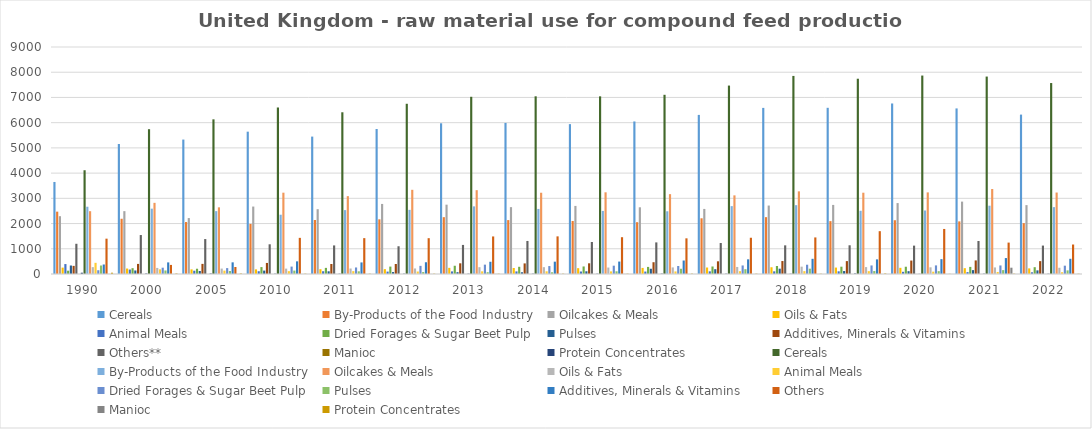
| Category | Cereals | By-Products of the Food Industry | Oilcakes & Meals | Oils & Fats | Animal Meals | Dried Forages & Sugar Beet Pulp
 | Pulses | Additives, Minerals & Vitamins | Others** | Manioc | Protein Concentrates | Others |
|---|---|---|---|---|---|---|---|---|---|---|---|---|
| 1990 | 4114 | 2667 | 2490 | 272 | 443 | 149 | 337 | 377 | 1198 | 3 | 51 | 1401 |
| 2000 | 5741 | 2590 | 2821 | 241 | 185 | 250 | 140 | 460 | 1545 | 0 | 21 | 360 |
| 2005 | 6132 | 2492 | 2643 | 215 | 134 | 234 | 119 | 462 | 1385 | 0 | 21 | 277 |
| 2010 | 6602 | 2350 | 3224 | 213 | 113 | 294 | 135 | 502 | 1178 | 2 | 13 | 1433 |
| 2011 | 6412 | 2533 | 3087 | 218 | 114 | 259 | 107 | 459 | 1133 | 1 | 13 | 1422 |
| 2012 | 6749 | 2543 | 3338 | 219 | 99 | 323 | 77 | 466 | 1100 | 3 | 13 | 1420 |
| 2013 | 7026 | 2681 | 3324 | 270 | 106 | 371 | 72 | 485 | 1153 | 4 | 13 | 1489 |
| 2014 | 7045 | 2580 | 3222 | 271 | 107 | 315 | 69 | 489 | 1310 | 2 | 13 | 1492 |
| 2015 | 7044 | 2501 | 3239 | 256 | 104 | 330 | 107 | 493 | 1269 | 4 | 13 | 1459 |
| 2016 | 7105 | 2487 | 3166 | 261 | 102 | 317 | 208 | 535 | 1253 | 0 | 15 | 1414 |
| 2017 | 7471 | 2691 | 3118 | 279 | 112 | 339 | 191 | 582 | 1228 | 0 | 13 | 1437 |
| 2018 | 7853 | 2729 | 3277 | 291 | 113 | 368 | 211 | 602 | 1136 | 0 | 11 | 1450 |
| 2019 | 7742 | 2506 | 3223 | 274 | 113 | 339 | 117 | 580 | 1139 | 0 | 22 | 1698 |
| 2020 | 7868 | 2518 | 3236 | 265 | 93 | 341 | 113 | 589 | 1125 | 0 | 7 | 1786 |
| 2021 | 7828 | 2708 | 3369.1 | 260 | 81 | 339 | 154 | 632 | 1309 | 250 | 13 | 1245 |
| 2022 | 7571 | 2651 | 3230 | 247 | 71 | 330 | 144 | 603 | 1127 | 0 | 11 | 1169 |